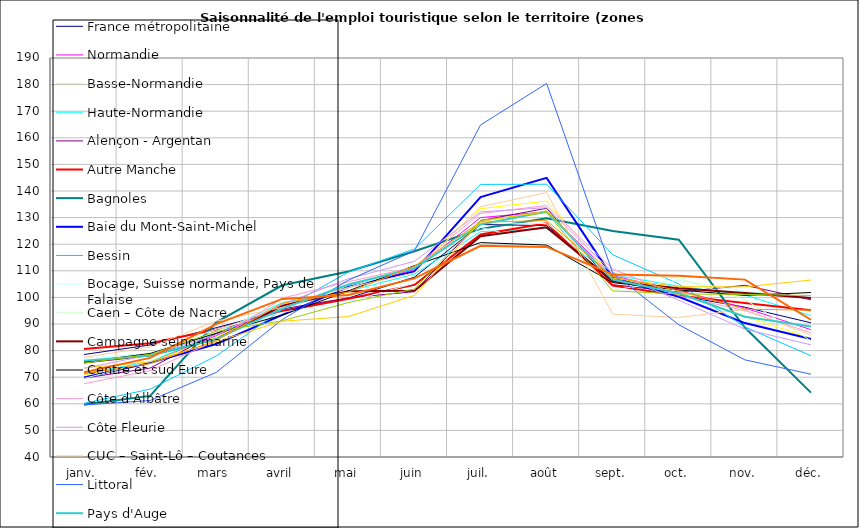
| Category | France métropolitaine | Normandie | Basse-Normandie | Haute-Normandie | Alençon - Argentan | Autre Manche | Bagnoles | Baie du Mont-Saint-Michel | Bessin | Bocage, Suisse normande, Pays de Falaise | Caen – Côte de Nacre | Campagne seino-marine | Centre et sud Eure | Côte d'Albâtre | Côte Fleurie | CUC – Saint-Lô – Coutances | Littoral | Pays d'Auge | Reste de l'Orne | Risle estuaire et Charentonne | Roumois - Vallée de la Seine – Vexin normand | Vallée de la Seine – Seine-Maritime |
|---|---|---|---|---|---|---|---|---|---|---|---|---|---|---|---|---|---|---|---|---|---|---|
| janv. | 78.525 | 71.102 | 70.936 | 71.363 | 69.648 | 80.592 | 59.701 | 69.921 | 60.173 | 77.108 | 69.528 | 75.534 | 75.678 | 67.569 | 73.31 | 77.45 | 59.548 | 76.202 | 75.323 | 73.49 | 71.303 | 71.829 |
| fév. | 82.133 | 75.656 | 75.544 | 75.831 | 73.444 | 82.78 | 62.973 | 75.406 | 65.522 | 78.918 | 76.017 | 78.219 | 78.927 | 72.446 | 78.426 | 81.365 | 61.247 | 78.182 | 78.571 | 75.742 | 75.111 | 77.253 |
| mars | 88.614 | 85.595 | 85.121 | 86.34 | 86.435 | 87.937 | 90.624 | 82.482 | 77.965 | 88.043 | 87.376 | 84.311 | 86.485 | 83.79 | 85.889 | 91.103 | 71.798 | 84.344 | 87.209 | 83.391 | 83.777 | 89.967 |
| avril | 95.123 | 96.677 | 95.815 | 98.032 | 95.662 | 94.801 | 104.566 | 93.423 | 95.522 | 94.393 | 96.634 | 96.867 | 93.334 | 99.719 | 97.368 | 96.262 | 91.683 | 95.773 | 91.22 | 91.04 | 97.796 | 99.436 |
| mai | 99.751 | 103.744 | 104.615 | 102.376 | 99.856 | 99.502 | 109.759 | 103.956 | 109.523 | 98.38 | 103.728 | 102.282 | 102.439 | 105.886 | 107.029 | 103.648 | 106.459 | 104.844 | 98.071 | 92.809 | 102.034 | 100.943 |
| juin | 107.619 | 110.424 | 111.486 | 108.756 | 102.136 | 104.77 | 117.374 | 109.747 | 118.219 | 105.315 | 111.42 | 102.479 | 111.944 | 111.428 | 113.566 | 109.209 | 117.505 | 110.924 | 103.165 | 100.767 | 111.707 | 107.151 |
| juil. | 127.412 | 130 | 133.358 | 124.725 | 128.881 | 123.63 | 125.762 | 137.684 | 142.482 | 126.326 | 127.973 | 123.007 | 120.599 | 131.546 | 132.142 | 134.091 | 164.813 | 127.44 | 128.994 | 128.453 | 128.306 | 119.371 |
| août | 126.959 | 132.194 | 136.221 | 125.867 | 133.506 | 127.874 | 129.724 | 144.951 | 142.548 | 120.014 | 127.773 | 126.327 | 119.673 | 134.553 | 133.728 | 139.406 | 180.428 | 132.294 | 131.86 | 132.559 | 128.879 | 118.977 |
| sept. | 106.435 | 108.115 | 107.869 | 108.502 | 104.781 | 104.461 | 124.969 | 107.466 | 116.033 | 102.811 | 109.354 | 106.071 | 105.551 | 110.705 | 109.379 | 93.719 | 109.161 | 106.692 | 102.438 | 107.196 | 107.8 | 108.613 |
| oct. | 100.656 | 102.578 | 101.549 | 104.195 | 101.982 | 100.665 | 121.665 | 100.234 | 105.046 | 106.464 | 107.257 | 103.474 | 102.786 | 100.649 | 98.921 | 92.446 | 89.704 | 101.538 | 101.312 | 104.05 | 102.502 | 108.181 |
| nov. | 96.321 | 96.046 | 92.963 | 100.889 | 104.561 | 97.855 | 88.684 | 90.355 | 88.911 | 102.262 | 99.221 | 101.685 | 100.745 | 95.015 | 88.079 | 95.443 | 76.523 | 92.706 | 101.117 | 103.958 | 95.592 | 106.683 |
| déc. | 90.453 | 87.868 | 84.523 | 93.124 | 99.108 | 95.134 | 64.2 | 84.375 | 78.054 | 99.966 | 83.72 | 99.744 | 101.84 | 86.695 | 82.164 | 85.858 | 71.131 | 89.062 | 100.721 | 106.545 | 95.193 | 91.597 |